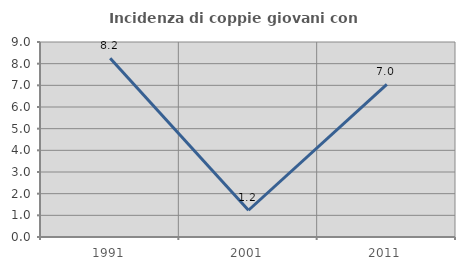
| Category | Incidenza di coppie giovani con figli |
|---|---|
| 1991.0 | 8.247 |
| 2001.0 | 1.235 |
| 2011.0 | 7.042 |